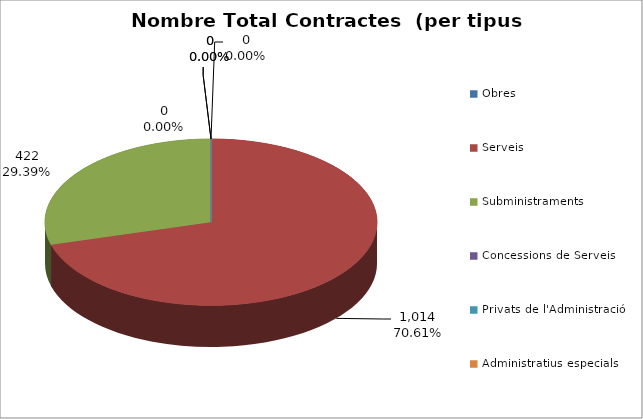
| Category | Nombre Total Contractes |
|---|---|
| Obres | 0 |
| Serveis | 1014 |
| Subministraments | 422 |
| Concessions de Serveis | 0 |
| Privats de l'Administració | 0 |
| Administratius especials | 0 |